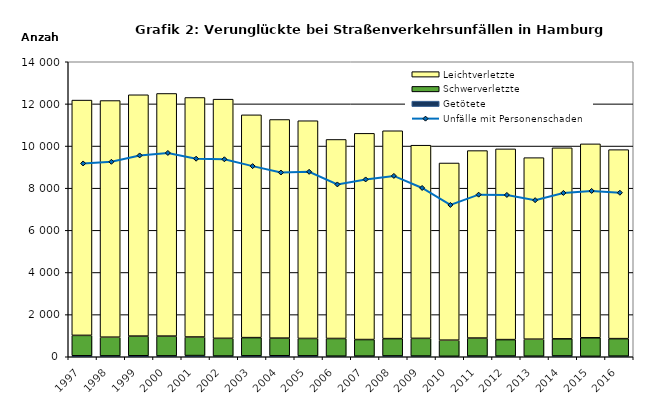
| Category | Getötete | Schwerverletzte | Leichtverletzte |
|---|---|---|---|
| 1997.0 | 46 | 969 | 11166 |
| 1998.0 | 42 | 887 | 11230 |
| 1999.0 | 47 | 933 | 11453 |
| 2000.0 | 41 | 939 | 11515 |
| 2001.0 | 56 | 882 | 11366 |
| 2002.0 | 34 | 841 | 11350 |
| 2003.0 | 44 | 864 | 10573 |
| 2004.0 | 48 | 836 | 10376 |
| 2005.0 | 43 | 826 | 10332 |
| 2006.0 | 28 | 839 | 9446 |
| 2007.0 | 30 | 787 | 9786 |
| 2008.0 | 40 | 821 | 9864 |
| 2009.0 | 33 | 840 | 9167 |
| 2010.0 | 22 | 765 | 8408 |
| 2011.0 | 34 | 853 | 8897 |
| 2012.0 | 33 | 781 | 9051 |
| 2013.0 | 26 | 808 | 8615 |
| 2014.0 | 38 | 812 | 9066 |
| 2015.0 | 20 | 880 | 9203 |
| 2016.0 | 29 | 831 | 8969 |